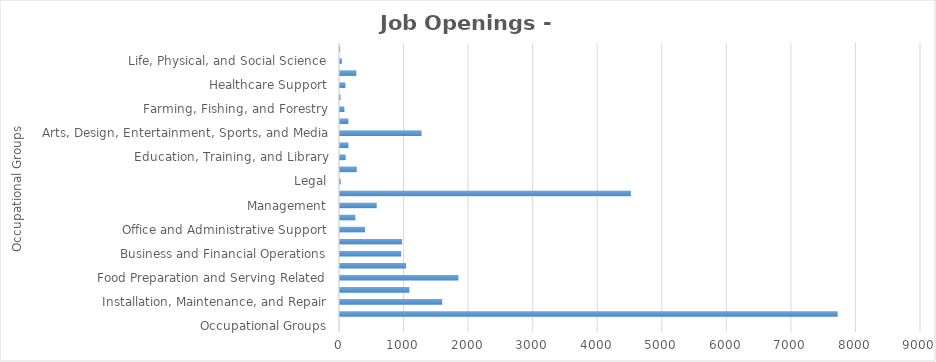
| Category | Series1 |
|---|---|
| Occupational Groups | 0 |
| Construction and Extraction | 7709 |
| Installation, Maintenance, and Repair | 1583 |
| Building and Grounds Cleaning and Maintenance | 1074 |
| Food Preparation and Serving Related | 1834 |
| Personal Care and Service | 1023 |
| Business and Financial Operations | 947 |
| Sales and Related | 961 |
| Office and Administrative Support | 389 |
| Architecture and Engineering | 238 |
| Management | 569 |
| Transportation and Material Moving | 4506 |
| Legal | 12 |
| Healthcare Practitioners and Technical | 259 |
| Education, Training, and Library | 88 |
| Production | 131 |
| Arts, Design, Entertainment, Sports, and Media | 1263 |
| Computer and Mathematical | 131 |
| Farming, Fishing, and Forestry | 68 |
| Community and Social Services | 9 |
| Healthcare Support | 84 |
| Protective Service | 253 |
| Life, Physical, and Social Science | 28 |
| Military Specific  | 3 |